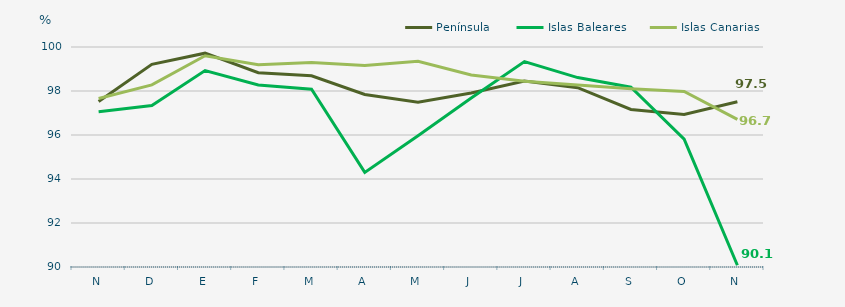
| Category | Península | Islas Baleares | Islas Canarias |
|---|---|---|---|
| N | 97.52 | 97.06 | 97.66 |
| D | 99.21 | 97.34 | 98.28 |
| E | 99.72 | 98.93 | 99.6 |
| F | 98.83 | 98.27 | 99.19 |
| M | 98.69 | 98.08 | 99.3 |
| A | 97.84 | 94.3 | 99.16 |
| M | 97.49 | 95.97 | 99.35 |
| J | 97.91 | 97.68 | 98.73 |
| J | 98.45 | 99.34 | 98.44 |
| A | 98.15 | 98.61 | 98.27 |
| S | 97.16 | 98.17 | 98.1 |
| O | 96.93 | 95.81 | 97.98 |
| N | 97.51 | 90.08 | 96.71 |